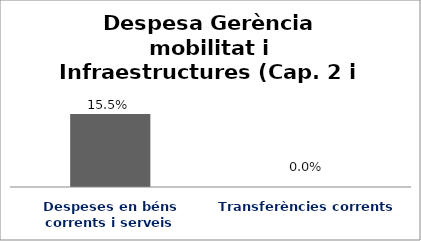
| Category | Series 0 |
|---|---|
| Despeses en béns corrents i serveis | 0.155 |
| Transferències corrents | 0 |